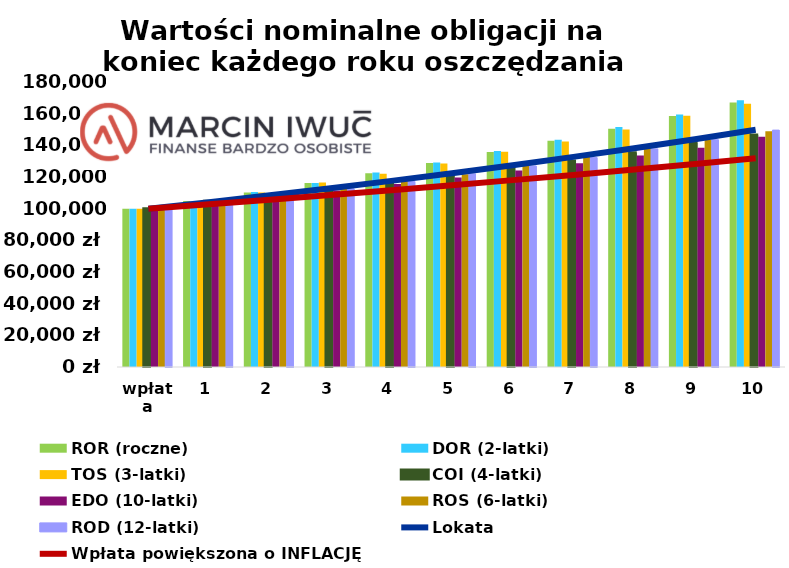
| Category | ROR (roczne) | DOR (2-latki) | TOS (3-latki) | COI (4-latki) | EDO (10-latki) | ROS (6-latki) | ROD (12-latki)  |
|---|---|---|---|---|---|---|---|
| wpłata | 100000 | 100000 | 100000 | 100000 | 100000 | 100000 | 100000 |
| koniec 1 roku | 104765.949 | 104594.04 | 104617 | 104738.5 | 103888 | 104900.5 | 104090.5 |
| koniec 2 roku | 110282.97 | 110531.524 | 110132.776 | 108237.907 | 107607.844 | 108834.771 | 108252.604 |
| koniec 3 roku | 116173.105 | 116237.429 | 116568.562 | 111881.7 | 111487.641 | 112948.052 | 112614.489 |
| koniec 4 roku | 122349.855 | 122835.354 | 122072.097 | 116242.837 | 115534.27 | 117248.487 | 117185.744 |
| koniec 5 roku | 128827.277 | 129118.041 | 128507.151 | 121858.916 | 119754.903 | 121744.591 | 121976.42 |
| koniec 6 roku | 135724.881 | 136446.918 | 136015.087 | 125930.708 | 124157.024 | 127012.269 | 126997.048 |
| koniec 7 roku | 142958.109 | 143472.377 | 142436.441 | 130170.503 | 128748.436 | 133236.41 | 132258.667 |
| koniec 8 roku | 150543.041 | 151615.719 | 149944.387 | 135244.655 | 133537.279 | 138233.462 | 137772.843 |
| koniec 9 roku | 158601.93 | 159457.149 | 158703.815 | 141778.721 | 138532.042 | 143457.877 | 143551.699 |
| koniec 10 roku | 167053.183 | 168508.178 | 166195.804 | 146516.205 | 145361.58 | 148920.001 | 149607.941 |